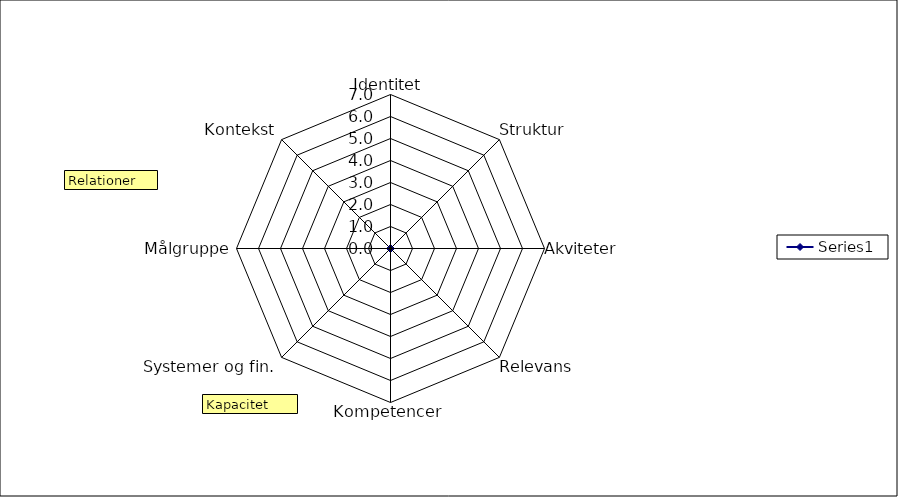
| Category | Series 0 |
|---|---|
| Identitet | 0 |
| Struktur | 0 |
| Akviteter | 0 |
| Relevans | 0 |
| Kompetencer | 0 |
| Systemer og fin. | 0 |
| Målgruppe | 0 |
| Kontekst | 0 |